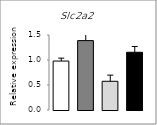
| Category | Series 0 |
|---|---|
| 0 | 0.979 |
| 1 | 1.388 |
| 2 | 0.574 |
| 3 | 1.154 |